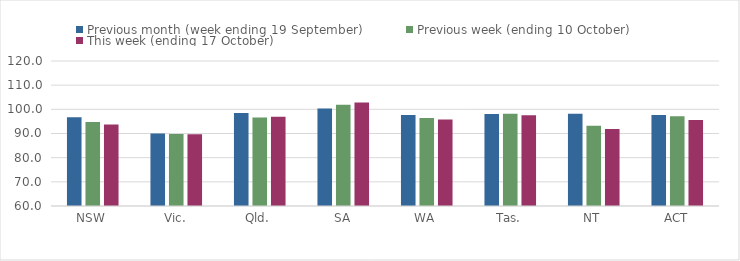
| Category | Previous month (week ending 19 September) | Previous week (ending 10 October) | This week (ending 17 October) |
|---|---|---|---|
| NSW | 96.72 | 94.81 | 93.7 |
| Vic. | 90.03 | 89.82 | 89.64 |
| Qld. | 98.53 | 96.6 | 96.98 |
| SA | 100.31 | 101.92 | 102.81 |
| WA | 97.63 | 96.45 | 95.84 |
| Tas. | 98.05 | 98.22 | 97.56 |
| NT | 98.2 | 93.22 | 91.86 |
| ACT | 97.61 | 97.15 | 95.57 |